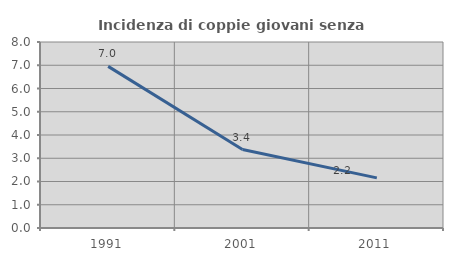
| Category | Incidenza di coppie giovani senza figli |
|---|---|
| 1991.0 | 6.952 |
| 2001.0 | 3.373 |
| 2011.0 | 2.156 |